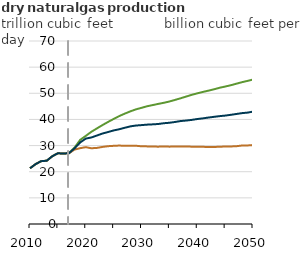
| Category | High oil and gas resource and technology | Low oil and gas resource and technology | Reference |
|---|---|---|---|
| 2010.0 | 21.316 | 21.316 | 21.316 |
| 2011.0 | 22.902 | 22.902 | 22.902 |
| 2012.0 | 24.033 | 24.033 | 24.033 |
| 2013.0 | 24.206 | 24.206 | 24.206 |
| 2014.0 | 25.926 | 25.926 | 25.926 |
| 2015.0 | 27.06 | 27.06 | 27.06 |
| 2016.0 | 26.94 | 26.94 | 26.94 |
| 2017.0 | 27.112 | 27.098 | 27.099 |
| 2018.0 | 29.252 | 28.483 | 28.958 |
| 2019.0 | 32.18 | 29.002 | 31.19 |
| 2020.0 | 33.691 | 29.39 | 32.661 |
| 2021.0 | 35.263 | 28.974 | 33.09 |
| 2022.0 | 36.563 | 29.106 | 33.844 |
| 2023.0 | 37.834 | 29.484 | 34.607 |
| 2024.0 | 39.033 | 29.766 | 35.179 |
| 2025.0 | 40.18 | 29.901 | 35.785 |
| 2026.0 | 41.278 | 30.007 | 36.235 |
| 2027.0 | 42.218 | 29.909 | 36.818 |
| 2028.0 | 43.088 | 29.909 | 37.349 |
| 2029.0 | 43.851 | 29.936 | 37.663 |
| 2030.0 | 44.433 | 29.718 | 37.829 |
| 2031.0 | 45.038 | 29.69 | 38.005 |
| 2032.0 | 45.487 | 29.632 | 38.117 |
| 2033.0 | 45.935 | 29.585 | 38.25 |
| 2034.0 | 46.359 | 29.662 | 38.546 |
| 2035.0 | 46.855 | 29.589 | 38.721 |
| 2036.0 | 47.456 | 29.638 | 39.017 |
| 2037.0 | 48.081 | 29.598 | 39.376 |
| 2038.0 | 48.742 | 29.632 | 39.57 |
| 2039.0 | 49.405 | 29.588 | 39.821 |
| 2040.0 | 49.976 | 29.564 | 40.155 |
| 2041.0 | 50.516 | 29.517 | 40.404 |
| 2042.0 | 51.003 | 29.464 | 40.718 |
| 2043.0 | 51.521 | 29.449 | 40.992 |
| 2044.0 | 52.108 | 29.562 | 41.256 |
| 2045.0 | 52.575 | 29.629 | 41.463 |
| 2046.0 | 53.068 | 29.667 | 41.76 |
| 2047.0 | 53.654 | 29.744 | 42.075 |
| 2048.0 | 54.234 | 30.012 | 42.4 |
| 2049.0 | 54.734 | 30.042 | 42.6 |
| 2050.0 | 55.266 | 30.202 | 42.979 |